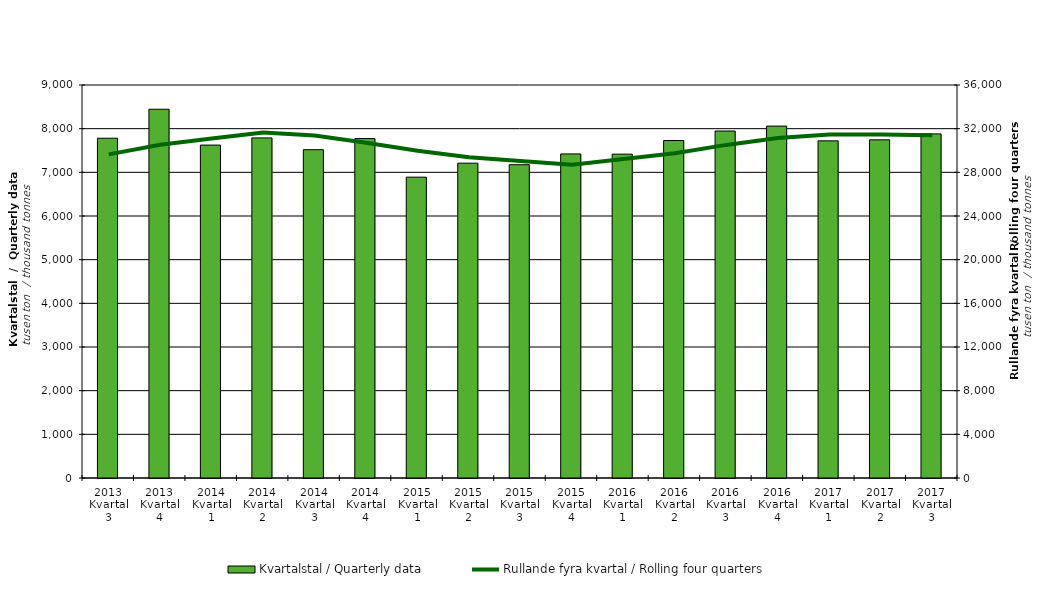
| Category | Kvartalstal / Quarterly data |
|---|---|
| 2013 Kvartal 3 | 7780.997 |
| 2013 Kvartal 4 | 8444.775 |
| 2014 Kvartal 1 | 7623.846 |
| 2014 Kvartal 2 | 7787.927 |
| 2014 Kvartal 3 | 7518.579 |
| 2014 Kvartal 4 | 7773.245 |
| 2015 Kvartal 1 | 6889.384 |
| 2015 Kvartal 2 | 7210.115 |
| 2015 Kvartal 3 | 7174.854 |
| 2015 Kvartal 4 | 7421.56 |
| 2016 Kvartal 1 | 7416.492 |
| 2016 Kvartal 2 | 7728.552 |
| 2016 Kvartal 3 | 7946.436 |
| 2016 Kvartal 4 | 8058.563 |
| 2017 Kvartal 1 | 7720.765 |
| 2017 Kvartal 2 | 7744.581 |
| 2017 Kvartal 3 | 7880.585 |